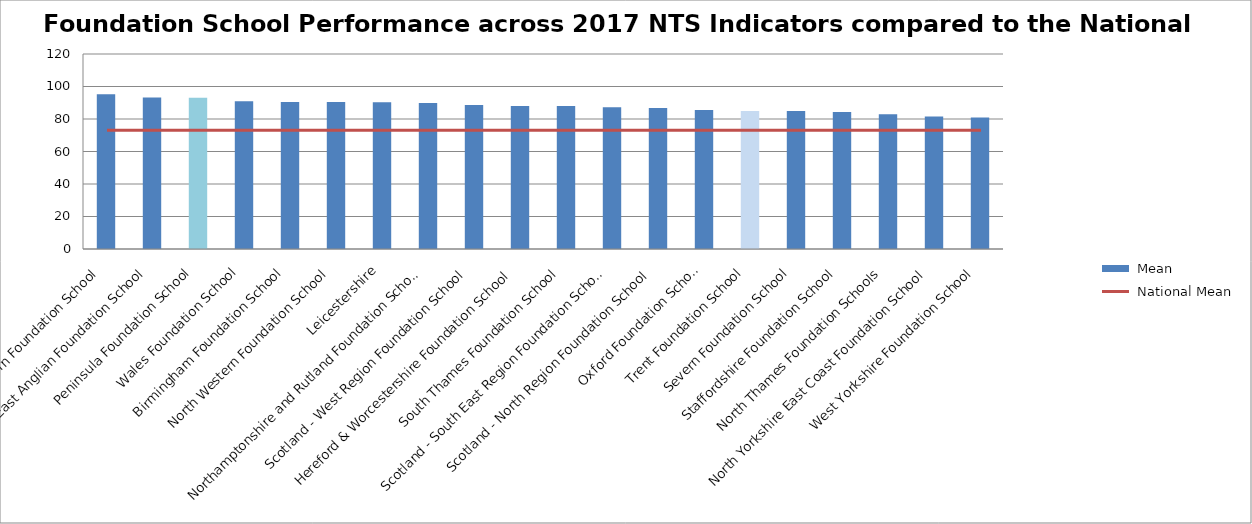
| Category |  Mean |
|---|---|
| Northern Foundation School | 95.25 |
| East Anglian Foundation School | 93.25 |
| Peninsula Foundation School | 93.14 |
| Wales Foundation School | 90.88 |
| Birmingham Foundation School | 90.5 |
| North Western Foundation School | 90.45 |
| Leicestershire, Northamptonshire and Rutland Foundation School | 90.3 |
| Scotland - West Region Foundation School | 89.9 |
| Hereford & Worcestershire Foundation School | 88.6 |
| South Thames Foundation School | 88.07 |
| Scotland - South East Region Foundation School | 88 |
| Scotland - North Region Foundation School | 87.17 |
| Oxford Foundation School | 86.8 |
| Trent Foundation School | 85.57 |
| Severn Foundation School | 85 |
| Staffordshire Foundation School | 84.86 |
| North Thames Foundation Schools | 84.24 |
| North Yorkshire East Coast Foundation School | 82.86 |
| West Yorkshire Foundation School | 81.5 |
| Mersey Foundation School | 81 |